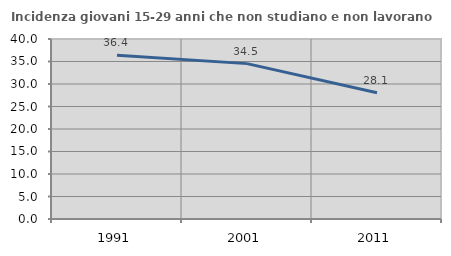
| Category | Incidenza giovani 15-29 anni che non studiano e non lavorano  |
|---|---|
| 1991.0 | 36.393 |
| 2001.0 | 34.528 |
| 2011.0 | 28.063 |